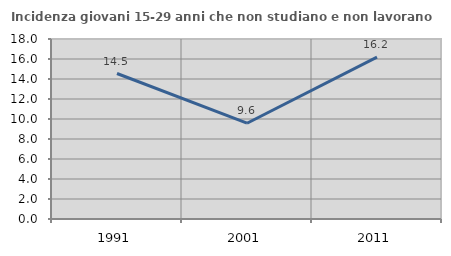
| Category | Incidenza giovani 15-29 anni che non studiano e non lavorano  |
|---|---|
| 1991.0 | 14.549 |
| 2001.0 | 9.579 |
| 2011.0 | 16.179 |